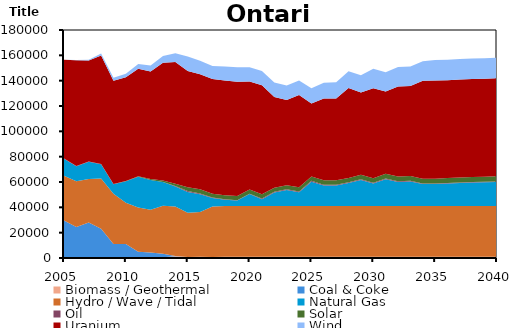
| Category | Biomass / Geothermal | Coal & Coke | Hydro / Wave / Tidal | Natural Gas | Oil | Solar | Uranium | Wind |
|---|---|---|---|---|---|---|---|---|
| 2005.0 | 807.529 | 28734.08 | 35480 | 13282.59 | 309.945 | 0 | 77969 | 26 |
| 2006.0 | 733.505 | 23808.08 | 36031.99 | 11807.7 | 309.945 | 0 | 83457 | 145 |
| 2007.0 | 598.952 | 27468.72 | 34315 | 13530.81 | 309.945 | 0 | 79750 | 494 |
| 2008.0 | 484.043 | 22638.21 | 39614.99 | 11214.3 | 182.56 | 0 | 85832 | 1400 |
| 2009.0 | 657.054 | 10461.15 | 39685.01 | 7490.896 | 215.245 | 5 | 81395.98 | 2300 |
| 2010.0 | 735.096 | 10336.62 | 32555 | 16885.54 | 73.471 | 123 | 81975 | 2800 |
| 2011.0 | 607.886 | 4329.339 | 34907 | 24281.59 | 45.67 | 398 | 84766 | 3899.999 |
| 2012.0 | 672.858 | 3596.735 | 33887 | 23380.22 | 65.78 | 842 | 84866 | 4600 |
| 2013.0 | 586.338 | 2742.243 | 37936 | 18653.16 | 45.152 | 1173 | 93102.99 | 5200 |
| 2014.0 | 1429.387 | 94.811 | 39199.48 | 15720.97 | 381.129 | 1757.707 | 96195.59 | 6900.642 |
| 2015.0 | 815.734 | 0 | 34947.93 | 16399.83 | 706.741 | 2953.841 | 91768.76 | 11395.51 |
| 2016.0 | 944.767 | 0 | 35280.38 | 14173.07 | 558.684 | 3238.468 | 90873.27 | 10581.07 |
| 2017.0 | 816.903 | 0 | 39823.02 | 6811.207 | 335.171 | 2987.91 | 90618.29 | 10181.73 |
| 2018.0 | 1057.174 | 0 | 39934.5 | 5085.19 | 360.241 | 3163.11 | 90474.5 | 11042.8 |
| 2019.0 | 1057.174 | 0 | 39943.96 | 4399.407 | 257 | 3240.196 | 90314.4 | 11375.68 |
| 2020.0 | 1057.174 | 0 | 39943.89 | 9561.932 | 257 | 3240.198 | 85235.87 | 11375.68 |
| 2021.0 | 1057.174 | 0 | 40004.74 | 5354.441 | 596.012 | 3240.198 | 86086.53 | 11375.69 |
| 2022.0 | 1057.174 | 0 | 40004.73 | 10575.02 | 596.012 | 3240.199 | 71632.63 | 11375.69 |
| 2023.0 | 1057.174 | 0 | 40004.73 | 12629.18 | 596.012 | 3240.198 | 67198.4 | 11375.68 |
| 2024.0 | 1057.174 | 0 | 40004.73 | 10833.59 | 596.012 | 3284.439 | 72918.67 | 11375.69 |
| 2025.0 | 1057.174 | 0 | 40004.72 | 19163.33 | 761.917 | 3328.675 | 57676.72 | 12036.66 |
| 2026.0 | 1057.174 | 0 | 40004.73 | 16180.22 | 674.527 | 3372.915 | 64638.73 | 12448.94 |
| 2027.0 | 1057.174 | 0 | 40004.71 | 16162.09 | 672.556 | 3417.152 | 64661.06 | 12861.23 |
| 2028.0 | 1057.174 | 0 | 40004.73 | 18083.4 | 600.102 | 3461.393 | 70915.7 | 13273.51 |
| 2029.0 | 1057.174 | 0 | 40004.7 | 20580.6 | 619.965 | 3505.632 | 64795.09 | 13698.07 |
| 2030.0 | 1057.174 | 0 | 40004.74 | 17715.74 | 597.72 | 3549.872 | 71049.72 | 15362.98 |
| 2031.0 | 1057.174 | 0 | 40004.73 | 21137.41 | 629.023 | 3594.11 | 64929.11 | 15376.99 |
| 2032.0 | 1057.174 | 0 | 40004.73 | 18961.13 | 608.413 | 3638.349 | 71183.75 | 15376.99 |
| 2033.0 | 1057.174 | 0 | 40017.87 | 19312.04 | 616.065 | 3682.588 | 71183.75 | 15376.99 |
| 2034.0 | 1057.174 | 0 | 40017.87 | 17292.44 | 435.26 | 3726.827 | 77438.39 | 15376.99 |
| 2035.0 | 1057.174 | 0 | 40038.11 | 17356.06 | 436.273 | 3771.065 | 77438.39 | 16204.18 |
| 2036.0 | 1057.174 | 0 | 39998.73 | 17789.54 | 440.224 | 3815.305 | 77190.3 | 16204.18 |
| 2037.0 | 1057.174 | 0 | 40029.17 | 18131.68 | 446.041 | 3859.543 | 77402.91 | 16204.18 |
| 2038.0 | 1057.174 | 0 | 40029.18 | 18430.36 | 450.621 | 3903.783 | 77438.39 | 16204.19 |
| 2039.0 | 1057.174 | 0 | 40049.47 | 18610.38 | 452.345 | 3948.022 | 77438.39 | 16204.19 |
| 2040.0 | 1057.174 | 0 | 40088.7 | 18883.65 | 454.158 | 3992.26 | 77438.39 | 16204.18 |